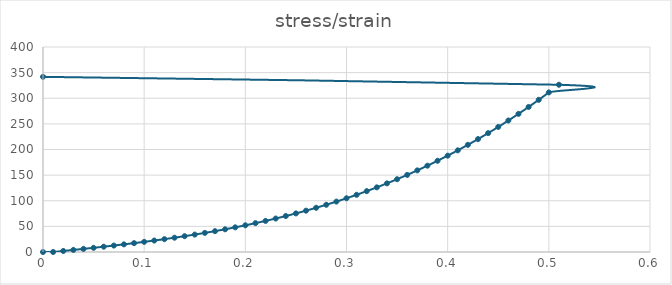
| Category | Series 0 |
|---|---|
| 0.0 | 0 |
| 0.01 | 0 |
| 0.02 | 2 |
| 0.03 | 4.026 |
| 0.04 | 6.088 |
| 0.05 | 8.196 |
| 0.060000000000000005 | 10.36 |
| 0.07 | 12.59 |
| 0.08 | 14.895 |
| 0.09 | 17.286 |
| 0.09999999999999999 | 19.773 |
| 0.10999999999999999 | 22.365 |
| 0.11999999999999998 | 25.073 |
| 0.12999999999999998 | 27.905 |
| 0.13999999999999999 | 30.873 |
| 0.15 | 33.987 |
| 0.16 | 37.255 |
| 0.17 | 40.688 |
| 0.18000000000000002 | 44.296 |
| 0.19000000000000003 | 48.089 |
| 0.20000000000000004 | 52.076 |
| 0.21000000000000005 | 56.268 |
| 0.22000000000000006 | 60.675 |
| 0.23000000000000007 | 65.305 |
| 0.24000000000000007 | 70.171 |
| 0.25000000000000006 | 75.28 |
| 0.26000000000000006 | 80.644 |
| 0.2700000000000001 | 86.271 |
| 0.2800000000000001 | 92.173 |
| 0.2900000000000001 | 98.359 |
| 0.3000000000000001 | 104.838 |
| 0.3100000000000001 | 111.621 |
| 0.3200000000000001 | 118.718 |
| 0.3300000000000001 | 126.138 |
| 0.34000000000000014 | 133.891 |
| 0.35000000000000014 | 141.988 |
| 0.36000000000000015 | 150.439 |
| 0.37000000000000016 | 159.252 |
| 0.38000000000000017 | 168.439 |
| 0.3900000000000002 | 178.008 |
| 0.4000000000000002 | 187.971 |
| 0.4100000000000002 | 198.336 |
| 0.4200000000000002 | 209.114 |
| 0.4300000000000002 | 220.315 |
| 0.4400000000000002 | 231.948 |
| 0.45000000000000023 | 244.024 |
| 0.46000000000000024 | 256.552 |
| 0.47000000000000025 | 269.542 |
| 0.48000000000000026 | 283.005 |
| 0.49000000000000027 | 296.95 |
| 0.5000000000000002 | 311.386 |
| 0.5100000000000002 | 326.325 |